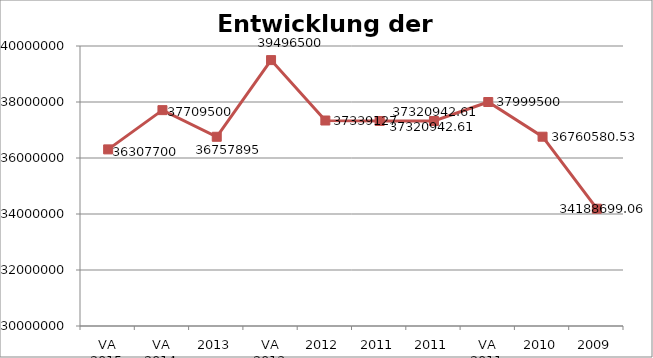
| Category | Gesamtverschuldung |
|---|---|
| VA 2015 | 36307700 |
| VA 2014 | 37709500 |
| 2013 | 36757895 |
| VA 2013 | 39496500 |
| 2012 | 37339127 |
| 2011 | 37320942.61 |
| 2011 | 37320942.61 |
| VA 2011 | 37999500 |
| 2010 | 36760580.53 |
| 2009 | 34188699.056 |